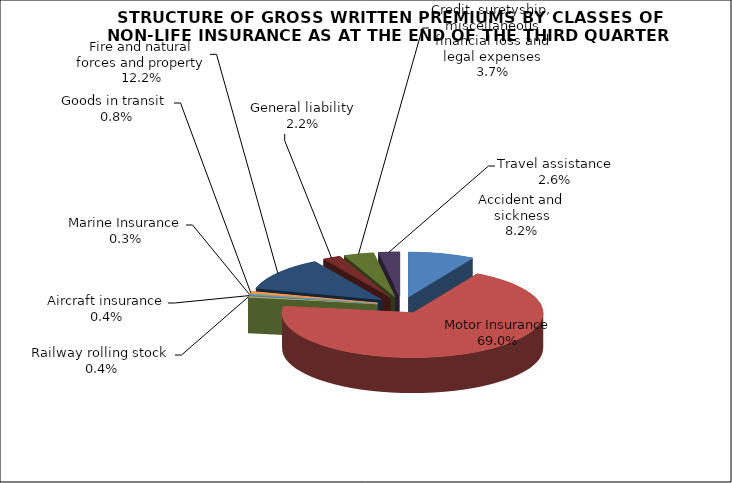
| Category | Accident and sickness |
|---|---|
| Accident and sickness | 0.082 |
| Motor Insurance | 0.69 |
| Railway rolling stock  | 0.004 |
| Aircraft insurance | 0.004 |
| Marine Insurance | 0.003 |
| Goods in transit  | 0.008 |
| Fire and natural forces and property | 0.122 |
| General liability | 0.022 |
| Credit, suretyship, miscellaneous financial loss and legal expenses | 0.037 |
| Travel assistance | 0.026 |